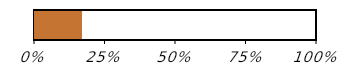
| Category | Købsfremskridt (1 af 6) |
|---|---|
| Købt | 0.167 |